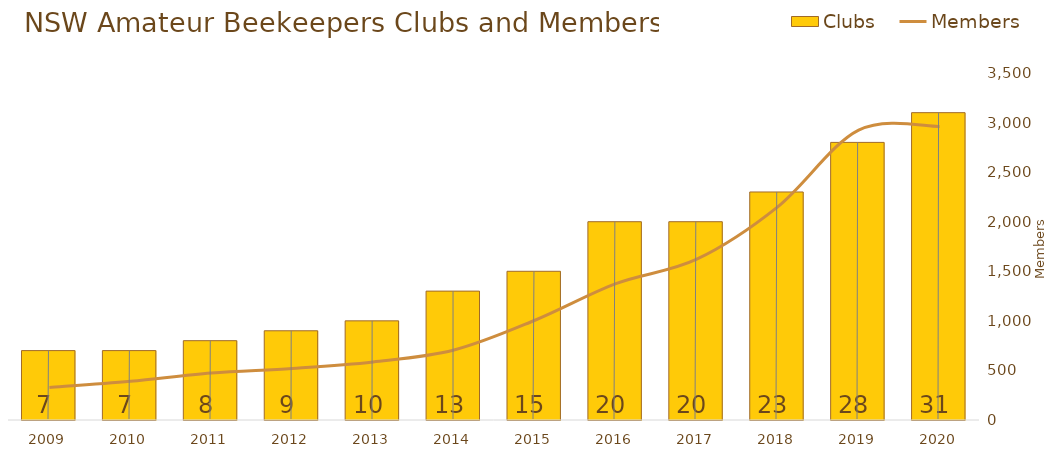
| Category | Clubs |
|---|---|
| 2009.0 | 7 |
| 2010.0 | 7 |
| 2011.0 | 8 |
| 2012.0 | 9 |
| 2013.0 | 10 |
| 2014.0 | 13 |
| 2015.0 | 15 |
| 2016.0 | 20 |
| 2017.0 | 20 |
| 2018.0 | 23 |
| 2019.0 | 28 |
| 2020.0 | 31 |